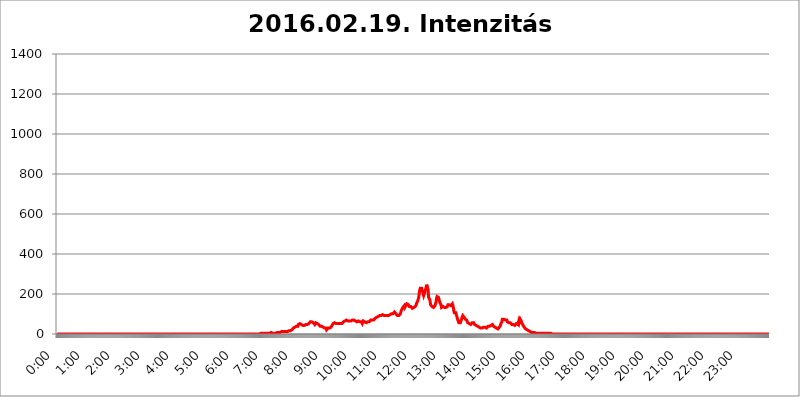
| Category | 2016.02.19. Intenzitás [W/m^2] |
|---|---|
| 0.0 | 0 |
| 0.0006944444444444445 | 0 |
| 0.001388888888888889 | 0 |
| 0.0020833333333333333 | 0 |
| 0.002777777777777778 | 0 |
| 0.003472222222222222 | 0 |
| 0.004166666666666667 | 0 |
| 0.004861111111111111 | 0 |
| 0.005555555555555556 | 0 |
| 0.0062499999999999995 | 0 |
| 0.006944444444444444 | 0 |
| 0.007638888888888889 | 0 |
| 0.008333333333333333 | 0 |
| 0.009027777777777779 | 0 |
| 0.009722222222222222 | 0 |
| 0.010416666666666666 | 0 |
| 0.011111111111111112 | 0 |
| 0.011805555555555555 | 0 |
| 0.012499999999999999 | 0 |
| 0.013194444444444444 | 0 |
| 0.013888888888888888 | 0 |
| 0.014583333333333332 | 0 |
| 0.015277777777777777 | 0 |
| 0.015972222222222224 | 0 |
| 0.016666666666666666 | 0 |
| 0.017361111111111112 | 0 |
| 0.018055555555555557 | 0 |
| 0.01875 | 0 |
| 0.019444444444444445 | 0 |
| 0.02013888888888889 | 0 |
| 0.020833333333333332 | 0 |
| 0.02152777777777778 | 0 |
| 0.022222222222222223 | 0 |
| 0.02291666666666667 | 0 |
| 0.02361111111111111 | 0 |
| 0.024305555555555556 | 0 |
| 0.024999999999999998 | 0 |
| 0.025694444444444447 | 0 |
| 0.02638888888888889 | 0 |
| 0.027083333333333334 | 0 |
| 0.027777777777777776 | 0 |
| 0.02847222222222222 | 0 |
| 0.029166666666666664 | 0 |
| 0.029861111111111113 | 0 |
| 0.030555555555555555 | 0 |
| 0.03125 | 0 |
| 0.03194444444444445 | 0 |
| 0.03263888888888889 | 0 |
| 0.03333333333333333 | 0 |
| 0.034027777777777775 | 0 |
| 0.034722222222222224 | 0 |
| 0.035416666666666666 | 0 |
| 0.036111111111111115 | 0 |
| 0.03680555555555556 | 0 |
| 0.0375 | 0 |
| 0.03819444444444444 | 0 |
| 0.03888888888888889 | 0 |
| 0.03958333333333333 | 0 |
| 0.04027777777777778 | 0 |
| 0.04097222222222222 | 0 |
| 0.041666666666666664 | 0 |
| 0.042361111111111106 | 0 |
| 0.04305555555555556 | 0 |
| 0.043750000000000004 | 0 |
| 0.044444444444444446 | 0 |
| 0.04513888888888889 | 0 |
| 0.04583333333333334 | 0 |
| 0.04652777777777778 | 0 |
| 0.04722222222222222 | 0 |
| 0.04791666666666666 | 0 |
| 0.04861111111111111 | 0 |
| 0.049305555555555554 | 0 |
| 0.049999999999999996 | 0 |
| 0.05069444444444445 | 0 |
| 0.051388888888888894 | 0 |
| 0.052083333333333336 | 0 |
| 0.05277777777777778 | 0 |
| 0.05347222222222222 | 0 |
| 0.05416666666666667 | 0 |
| 0.05486111111111111 | 0 |
| 0.05555555555555555 | 0 |
| 0.05625 | 0 |
| 0.05694444444444444 | 0 |
| 0.057638888888888885 | 0 |
| 0.05833333333333333 | 0 |
| 0.05902777777777778 | 0 |
| 0.059722222222222225 | 0 |
| 0.06041666666666667 | 0 |
| 0.061111111111111116 | 0 |
| 0.06180555555555556 | 0 |
| 0.0625 | 0 |
| 0.06319444444444444 | 0 |
| 0.06388888888888888 | 0 |
| 0.06458333333333334 | 0 |
| 0.06527777777777778 | 0 |
| 0.06597222222222222 | 0 |
| 0.06666666666666667 | 0 |
| 0.06736111111111111 | 0 |
| 0.06805555555555555 | 0 |
| 0.06874999999999999 | 0 |
| 0.06944444444444443 | 0 |
| 0.07013888888888889 | 0 |
| 0.07083333333333333 | 0 |
| 0.07152777777777779 | 0 |
| 0.07222222222222223 | 0 |
| 0.07291666666666667 | 0 |
| 0.07361111111111111 | 0 |
| 0.07430555555555556 | 0 |
| 0.075 | 0 |
| 0.07569444444444444 | 0 |
| 0.0763888888888889 | 0 |
| 0.07708333333333334 | 0 |
| 0.07777777777777778 | 0 |
| 0.07847222222222222 | 0 |
| 0.07916666666666666 | 0 |
| 0.0798611111111111 | 0 |
| 0.08055555555555556 | 0 |
| 0.08125 | 0 |
| 0.08194444444444444 | 0 |
| 0.08263888888888889 | 0 |
| 0.08333333333333333 | 0 |
| 0.08402777777777777 | 0 |
| 0.08472222222222221 | 0 |
| 0.08541666666666665 | 0 |
| 0.08611111111111112 | 0 |
| 0.08680555555555557 | 0 |
| 0.08750000000000001 | 0 |
| 0.08819444444444445 | 0 |
| 0.08888888888888889 | 0 |
| 0.08958333333333333 | 0 |
| 0.09027777777777778 | 0 |
| 0.09097222222222222 | 0 |
| 0.09166666666666667 | 0 |
| 0.09236111111111112 | 0 |
| 0.09305555555555556 | 0 |
| 0.09375 | 0 |
| 0.09444444444444444 | 0 |
| 0.09513888888888888 | 0 |
| 0.09583333333333333 | 0 |
| 0.09652777777777777 | 0 |
| 0.09722222222222222 | 0 |
| 0.09791666666666667 | 0 |
| 0.09861111111111111 | 0 |
| 0.09930555555555555 | 0 |
| 0.09999999999999999 | 0 |
| 0.10069444444444443 | 0 |
| 0.1013888888888889 | 0 |
| 0.10208333333333335 | 0 |
| 0.10277777777777779 | 0 |
| 0.10347222222222223 | 0 |
| 0.10416666666666667 | 0 |
| 0.10486111111111111 | 0 |
| 0.10555555555555556 | 0 |
| 0.10625 | 0 |
| 0.10694444444444444 | 0 |
| 0.1076388888888889 | 0 |
| 0.10833333333333334 | 0 |
| 0.10902777777777778 | 0 |
| 0.10972222222222222 | 0 |
| 0.1111111111111111 | 0 |
| 0.11180555555555556 | 0 |
| 0.11180555555555556 | 0 |
| 0.1125 | 0 |
| 0.11319444444444444 | 0 |
| 0.11388888888888889 | 0 |
| 0.11458333333333333 | 0 |
| 0.11527777777777777 | 0 |
| 0.11597222222222221 | 0 |
| 0.11666666666666665 | 0 |
| 0.1173611111111111 | 0 |
| 0.11805555555555557 | 0 |
| 0.11944444444444445 | 0 |
| 0.12013888888888889 | 0 |
| 0.12083333333333333 | 0 |
| 0.12152777777777778 | 0 |
| 0.12222222222222223 | 0 |
| 0.12291666666666667 | 0 |
| 0.12291666666666667 | 0 |
| 0.12361111111111112 | 0 |
| 0.12430555555555556 | 0 |
| 0.125 | 0 |
| 0.12569444444444444 | 0 |
| 0.12638888888888888 | 0 |
| 0.12708333333333333 | 0 |
| 0.16875 | 0 |
| 0.12847222222222224 | 0 |
| 0.12916666666666668 | 0 |
| 0.12986111111111112 | 0 |
| 0.13055555555555556 | 0 |
| 0.13125 | 0 |
| 0.13194444444444445 | 0 |
| 0.1326388888888889 | 0 |
| 0.13333333333333333 | 0 |
| 0.13402777777777777 | 0 |
| 0.13402777777777777 | 0 |
| 0.13472222222222222 | 0 |
| 0.13541666666666666 | 0 |
| 0.1361111111111111 | 0 |
| 0.13749999999999998 | 0 |
| 0.13819444444444443 | 0 |
| 0.1388888888888889 | 0 |
| 0.13958333333333334 | 0 |
| 0.14027777777777778 | 0 |
| 0.14097222222222222 | 0 |
| 0.14166666666666666 | 0 |
| 0.1423611111111111 | 0 |
| 0.14305555555555557 | 0 |
| 0.14375000000000002 | 0 |
| 0.14444444444444446 | 0 |
| 0.1451388888888889 | 0 |
| 0.1451388888888889 | 0 |
| 0.14652777777777778 | 0 |
| 0.14722222222222223 | 0 |
| 0.14791666666666667 | 0 |
| 0.1486111111111111 | 0 |
| 0.14930555555555555 | 0 |
| 0.15 | 0 |
| 0.15069444444444444 | 0 |
| 0.15138888888888888 | 0 |
| 0.15208333333333332 | 0 |
| 0.15277777777777776 | 0 |
| 0.15347222222222223 | 0 |
| 0.15416666666666667 | 0 |
| 0.15486111111111112 | 0 |
| 0.15555555555555556 | 0 |
| 0.15625 | 0 |
| 0.15694444444444444 | 0 |
| 0.15763888888888888 | 0 |
| 0.15833333333333333 | 0 |
| 0.15902777777777777 | 0 |
| 0.15972222222222224 | 0 |
| 0.16041666666666668 | 0 |
| 0.16111111111111112 | 0 |
| 0.16180555555555556 | 0 |
| 0.1625 | 0 |
| 0.16319444444444445 | 0 |
| 0.1638888888888889 | 0 |
| 0.16458333333333333 | 0 |
| 0.16527777777777777 | 0 |
| 0.16597222222222222 | 0 |
| 0.16666666666666666 | 0 |
| 0.1673611111111111 | 0 |
| 0.16805555555555554 | 0 |
| 0.16874999999999998 | 0 |
| 0.16944444444444443 | 0 |
| 0.17013888888888887 | 0 |
| 0.1708333333333333 | 0 |
| 0.17152777777777775 | 0 |
| 0.17222222222222225 | 0 |
| 0.1729166666666667 | 0 |
| 0.17361111111111113 | 0 |
| 0.17430555555555557 | 0 |
| 0.17500000000000002 | 0 |
| 0.17569444444444446 | 0 |
| 0.1763888888888889 | 0 |
| 0.17708333333333334 | 0 |
| 0.17777777777777778 | 0 |
| 0.17847222222222223 | 0 |
| 0.17916666666666667 | 0 |
| 0.1798611111111111 | 0 |
| 0.18055555555555555 | 0 |
| 0.18125 | 0 |
| 0.18194444444444444 | 0 |
| 0.1826388888888889 | 0 |
| 0.18333333333333335 | 0 |
| 0.1840277777777778 | 0 |
| 0.18472222222222223 | 0 |
| 0.18541666666666667 | 0 |
| 0.18611111111111112 | 0 |
| 0.18680555555555556 | 0 |
| 0.1875 | 0 |
| 0.18819444444444444 | 0 |
| 0.18888888888888888 | 0 |
| 0.18958333333333333 | 0 |
| 0.19027777777777777 | 0 |
| 0.1909722222222222 | 0 |
| 0.19166666666666665 | 0 |
| 0.19236111111111112 | 0 |
| 0.19305555555555554 | 0 |
| 0.19375 | 0 |
| 0.19444444444444445 | 0 |
| 0.1951388888888889 | 0 |
| 0.19583333333333333 | 0 |
| 0.19652777777777777 | 0 |
| 0.19722222222222222 | 0 |
| 0.19791666666666666 | 0 |
| 0.1986111111111111 | 0 |
| 0.19930555555555554 | 0 |
| 0.19999999999999998 | 0 |
| 0.20069444444444443 | 0 |
| 0.20138888888888887 | 0 |
| 0.2020833333333333 | 0 |
| 0.2027777777777778 | 0 |
| 0.2034722222222222 | 0 |
| 0.2041666666666667 | 0 |
| 0.20486111111111113 | 0 |
| 0.20555555555555557 | 0 |
| 0.20625000000000002 | 0 |
| 0.20694444444444446 | 0 |
| 0.2076388888888889 | 0 |
| 0.20833333333333334 | 0 |
| 0.20902777777777778 | 0 |
| 0.20972222222222223 | 0 |
| 0.21041666666666667 | 0 |
| 0.2111111111111111 | 0 |
| 0.21180555555555555 | 0 |
| 0.2125 | 0 |
| 0.21319444444444444 | 0 |
| 0.2138888888888889 | 0 |
| 0.21458333333333335 | 0 |
| 0.2152777777777778 | 0 |
| 0.21597222222222223 | 0 |
| 0.21666666666666667 | 0 |
| 0.21736111111111112 | 0 |
| 0.21805555555555556 | 0 |
| 0.21875 | 0 |
| 0.21944444444444444 | 0 |
| 0.22013888888888888 | 0 |
| 0.22083333333333333 | 0 |
| 0.22152777777777777 | 0 |
| 0.2222222222222222 | 0 |
| 0.22291666666666665 | 0 |
| 0.2236111111111111 | 0 |
| 0.22430555555555556 | 0 |
| 0.225 | 0 |
| 0.22569444444444445 | 0 |
| 0.2263888888888889 | 0 |
| 0.22708333333333333 | 0 |
| 0.22777777777777777 | 0 |
| 0.22847222222222222 | 0 |
| 0.22916666666666666 | 0 |
| 0.2298611111111111 | 0 |
| 0.23055555555555554 | 0 |
| 0.23124999999999998 | 0 |
| 0.23194444444444443 | 0 |
| 0.23263888888888887 | 0 |
| 0.2333333333333333 | 0 |
| 0.2340277777777778 | 0 |
| 0.2347222222222222 | 0 |
| 0.2354166666666667 | 0 |
| 0.23611111111111113 | 0 |
| 0.23680555555555557 | 0 |
| 0.23750000000000002 | 0 |
| 0.23819444444444446 | 0 |
| 0.2388888888888889 | 0 |
| 0.23958333333333334 | 0 |
| 0.24027777777777778 | 0 |
| 0.24097222222222223 | 0 |
| 0.24166666666666667 | 0 |
| 0.2423611111111111 | 0 |
| 0.24305555555555555 | 0 |
| 0.24375 | 0 |
| 0.24444444444444446 | 0 |
| 0.24513888888888888 | 0 |
| 0.24583333333333335 | 0 |
| 0.2465277777777778 | 0 |
| 0.24722222222222223 | 0 |
| 0.24791666666666667 | 0 |
| 0.24861111111111112 | 0 |
| 0.24930555555555556 | 0 |
| 0.25 | 0 |
| 0.25069444444444444 | 0 |
| 0.2513888888888889 | 0 |
| 0.2520833333333333 | 0 |
| 0.25277777777777777 | 0 |
| 0.2534722222222222 | 0 |
| 0.25416666666666665 | 0 |
| 0.2548611111111111 | 0 |
| 0.2555555555555556 | 0 |
| 0.25625000000000003 | 0 |
| 0.2569444444444445 | 0 |
| 0.2576388888888889 | 0 |
| 0.25833333333333336 | 0 |
| 0.2590277777777778 | 0 |
| 0.25972222222222224 | 0 |
| 0.2604166666666667 | 0 |
| 0.2611111111111111 | 0 |
| 0.26180555555555557 | 0 |
| 0.2625 | 0 |
| 0.26319444444444445 | 0 |
| 0.2638888888888889 | 0 |
| 0.26458333333333334 | 0 |
| 0.2652777777777778 | 0 |
| 0.2659722222222222 | 0 |
| 0.26666666666666666 | 0 |
| 0.2673611111111111 | 0 |
| 0.26805555555555555 | 0 |
| 0.26875 | 0 |
| 0.26944444444444443 | 0 |
| 0.2701388888888889 | 0 |
| 0.2708333333333333 | 0 |
| 0.27152777777777776 | 0 |
| 0.2722222222222222 | 0 |
| 0.27291666666666664 | 0 |
| 0.2736111111111111 | 0 |
| 0.2743055555555555 | 0 |
| 0.27499999999999997 | 0 |
| 0.27569444444444446 | 0 |
| 0.27638888888888885 | 0 |
| 0.27708333333333335 | 0 |
| 0.2777777777777778 | 0 |
| 0.27847222222222223 | 0 |
| 0.2791666666666667 | 0 |
| 0.2798611111111111 | 0 |
| 0.28055555555555556 | 0 |
| 0.28125 | 0 |
| 0.28194444444444444 | 0 |
| 0.2826388888888889 | 0 |
| 0.2833333333333333 | 0 |
| 0.28402777777777777 | 0 |
| 0.2847222222222222 | 0 |
| 0.28541666666666665 | 3.525 |
| 0.28611111111111115 | 3.525 |
| 0.28680555555555554 | 3.525 |
| 0.28750000000000003 | 3.525 |
| 0.2881944444444445 | 3.525 |
| 0.2888888888888889 | 3.525 |
| 0.28958333333333336 | 3.525 |
| 0.2902777777777778 | 3.525 |
| 0.29097222222222224 | 3.525 |
| 0.2916666666666667 | 3.525 |
| 0.2923611111111111 | 3.525 |
| 0.29305555555555557 | 3.525 |
| 0.29375 | 3.525 |
| 0.29444444444444445 | 3.525 |
| 0.2951388888888889 | 3.525 |
| 0.29583333333333334 | 3.525 |
| 0.2965277777777778 | 3.525 |
| 0.2972222222222222 | 3.525 |
| 0.29791666666666666 | 3.525 |
| 0.2986111111111111 | 3.525 |
| 0.29930555555555555 | 7.887 |
| 0.3 | 7.887 |
| 0.30069444444444443 | 3.525 |
| 0.3013888888888889 | 3.525 |
| 0.3020833333333333 | 3.525 |
| 0.30277777777777776 | 7.887 |
| 0.3034722222222222 | 7.887 |
| 0.30416666666666664 | 3.525 |
| 0.3048611111111111 | 3.525 |
| 0.3055555555555555 | 3.525 |
| 0.30624999999999997 | 3.525 |
| 0.3069444444444444 | 7.887 |
| 0.3076388888888889 | 7.887 |
| 0.30833333333333335 | 7.887 |
| 0.3090277777777778 | 7.887 |
| 0.30972222222222223 | 7.887 |
| 0.3104166666666667 | 7.887 |
| 0.3111111111111111 | 7.887 |
| 0.31180555555555556 | 7.887 |
| 0.3125 | 7.887 |
| 0.31319444444444444 | 7.887 |
| 0.3138888888888889 | 12.257 |
| 0.3145833333333333 | 12.257 |
| 0.31527777777777777 | 12.257 |
| 0.3159722222222222 | 12.257 |
| 0.31666666666666665 | 12.257 |
| 0.31736111111111115 | 12.257 |
| 0.31805555555555554 | 12.257 |
| 0.31875000000000003 | 12.257 |
| 0.3194444444444445 | 12.257 |
| 0.3201388888888889 | 12.257 |
| 0.32083333333333336 | 12.257 |
| 0.3215277777777778 | 12.257 |
| 0.32222222222222224 | 12.257 |
| 0.3229166666666667 | 12.257 |
| 0.3236111111111111 | 16.636 |
| 0.32430555555555557 | 16.636 |
| 0.325 | 16.636 |
| 0.32569444444444445 | 16.636 |
| 0.3263888888888889 | 16.636 |
| 0.32708333333333334 | 16.636 |
| 0.3277777777777778 | 21.024 |
| 0.3284722222222222 | 21.024 |
| 0.32916666666666666 | 21.024 |
| 0.3298611111111111 | 21.024 |
| 0.33055555555555555 | 25.419 |
| 0.33125 | 29.823 |
| 0.33194444444444443 | 29.823 |
| 0.3326388888888889 | 29.823 |
| 0.3333333333333333 | 34.234 |
| 0.3340277777777778 | 38.653 |
| 0.3347222222222222 | 38.653 |
| 0.3354166666666667 | 38.653 |
| 0.3361111111111111 | 38.653 |
| 0.3368055555555556 | 38.653 |
| 0.33749999999999997 | 38.653 |
| 0.33819444444444446 | 47.511 |
| 0.33888888888888885 | 51.951 |
| 0.33958333333333335 | 47.511 |
| 0.34027777777777773 | 51.951 |
| 0.34097222222222223 | 47.511 |
| 0.3416666666666666 | 47.511 |
| 0.3423611111111111 | 47.511 |
| 0.3430555555555555 | 47.511 |
| 0.34375 | 43.079 |
| 0.3444444444444445 | 43.079 |
| 0.3451388888888889 | 43.079 |
| 0.3458333333333334 | 43.079 |
| 0.34652777777777777 | 43.079 |
| 0.34722222222222227 | 47.511 |
| 0.34791666666666665 | 43.079 |
| 0.34861111111111115 | 47.511 |
| 0.34930555555555554 | 47.511 |
| 0.35000000000000003 | 47.511 |
| 0.3506944444444444 | 47.511 |
| 0.3513888888888889 | 47.511 |
| 0.3520833333333333 | 47.511 |
| 0.3527777777777778 | 51.951 |
| 0.3534722222222222 | 51.951 |
| 0.3541666666666667 | 56.398 |
| 0.3548611111111111 | 60.85 |
| 0.35555555555555557 | 65.31 |
| 0.35625 | 65.31 |
| 0.35694444444444445 | 60.85 |
| 0.3576388888888889 | 60.85 |
| 0.35833333333333334 | 56.398 |
| 0.3590277777777778 | 56.398 |
| 0.3597222222222222 | 56.398 |
| 0.36041666666666666 | 51.951 |
| 0.3611111111111111 | 47.511 |
| 0.36180555555555555 | 51.951 |
| 0.3625 | 56.398 |
| 0.36319444444444443 | 56.398 |
| 0.3638888888888889 | 56.398 |
| 0.3645833333333333 | 51.951 |
| 0.3652777777777778 | 47.511 |
| 0.3659722222222222 | 47.511 |
| 0.3666666666666667 | 47.511 |
| 0.3673611111111111 | 47.511 |
| 0.3680555555555556 | 43.079 |
| 0.36874999999999997 | 38.653 |
| 0.36944444444444446 | 38.653 |
| 0.37013888888888885 | 34.234 |
| 0.37083333333333335 | 38.653 |
| 0.37152777777777773 | 34.234 |
| 0.37222222222222223 | 34.234 |
| 0.3729166666666666 | 34.234 |
| 0.3736111111111111 | 29.823 |
| 0.3743055555555555 | 29.823 |
| 0.375 | 29.823 |
| 0.3756944444444445 | 29.823 |
| 0.3763888888888889 | 34.234 |
| 0.3770833333333334 | 29.823 |
| 0.37777777777777777 | 21.024 |
| 0.37847222222222227 | 21.024 |
| 0.37916666666666665 | 21.024 |
| 0.37986111111111115 | 29.823 |
| 0.38055555555555554 | 29.823 |
| 0.38125000000000003 | 29.823 |
| 0.3819444444444444 | 29.823 |
| 0.3826388888888889 | 29.823 |
| 0.3833333333333333 | 34.234 |
| 0.3840277777777778 | 34.234 |
| 0.3847222222222222 | 38.653 |
| 0.3854166666666667 | 43.079 |
| 0.3861111111111111 | 47.511 |
| 0.38680555555555557 | 51.951 |
| 0.3875 | 56.398 |
| 0.38819444444444445 | 56.398 |
| 0.3888888888888889 | 56.398 |
| 0.38958333333333334 | 56.398 |
| 0.3902777777777778 | 51.951 |
| 0.3909722222222222 | 51.951 |
| 0.39166666666666666 | 51.951 |
| 0.3923611111111111 | 51.951 |
| 0.39305555555555555 | 51.951 |
| 0.39375 | 51.951 |
| 0.39444444444444443 | 51.951 |
| 0.3951388888888889 | 51.951 |
| 0.3958333333333333 | 51.951 |
| 0.3965277777777778 | 51.951 |
| 0.3972222222222222 | 51.951 |
| 0.3979166666666667 | 51.951 |
| 0.3986111111111111 | 51.951 |
| 0.3993055555555556 | 51.951 |
| 0.39999999999999997 | 56.398 |
| 0.40069444444444446 | 56.398 |
| 0.40138888888888885 | 60.85 |
| 0.40208333333333335 | 60.85 |
| 0.40277777777777773 | 65.31 |
| 0.40347222222222223 | 65.31 |
| 0.4041666666666666 | 65.31 |
| 0.4048611111111111 | 69.775 |
| 0.4055555555555555 | 69.775 |
| 0.40625 | 69.775 |
| 0.4069444444444445 | 69.775 |
| 0.4076388888888889 | 65.31 |
| 0.4083333333333334 | 65.31 |
| 0.40902777777777777 | 65.31 |
| 0.40972222222222227 | 65.31 |
| 0.41041666666666665 | 65.31 |
| 0.41111111111111115 | 65.31 |
| 0.41180555555555554 | 65.31 |
| 0.41250000000000003 | 69.775 |
| 0.4131944444444444 | 69.775 |
| 0.4138888888888889 | 69.775 |
| 0.4145833333333333 | 69.775 |
| 0.4152777777777778 | 69.775 |
| 0.4159722222222222 | 69.775 |
| 0.4166666666666667 | 69.775 |
| 0.4173611111111111 | 69.775 |
| 0.41805555555555557 | 65.31 |
| 0.41875 | 65.31 |
| 0.41944444444444445 | 65.31 |
| 0.4201388888888889 | 60.85 |
| 0.42083333333333334 | 60.85 |
| 0.4215277777777778 | 60.85 |
| 0.4222222222222222 | 65.31 |
| 0.42291666666666666 | 65.31 |
| 0.4236111111111111 | 65.31 |
| 0.42430555555555555 | 60.85 |
| 0.425 | 60.85 |
| 0.42569444444444443 | 60.85 |
| 0.4263888888888889 | 60.85 |
| 0.4270833333333333 | 56.398 |
| 0.4277777777777778 | 51.951 |
| 0.4284722222222222 | 56.398 |
| 0.4291666666666667 | 65.31 |
| 0.4298611111111111 | 65.31 |
| 0.4305555555555556 | 65.31 |
| 0.43124999999999997 | 60.85 |
| 0.43194444444444446 | 60.85 |
| 0.43263888888888885 | 60.85 |
| 0.43333333333333335 | 56.398 |
| 0.43402777777777773 | 51.951 |
| 0.43472222222222223 | 56.398 |
| 0.4354166666666666 | 60.85 |
| 0.4361111111111111 | 65.31 |
| 0.4368055555555555 | 60.85 |
| 0.4375 | 60.85 |
| 0.4381944444444445 | 65.31 |
| 0.4388888888888889 | 65.31 |
| 0.4395833333333334 | 69.775 |
| 0.44027777777777777 | 69.775 |
| 0.44097222222222227 | 69.775 |
| 0.44166666666666665 | 69.775 |
| 0.44236111111111115 | 69.775 |
| 0.44305555555555554 | 69.775 |
| 0.44375000000000003 | 69.775 |
| 0.4444444444444444 | 74.246 |
| 0.4451388888888889 | 74.246 |
| 0.4458333333333333 | 78.722 |
| 0.4465277777777778 | 83.205 |
| 0.4472222222222222 | 83.205 |
| 0.4479166666666667 | 83.205 |
| 0.4486111111111111 | 83.205 |
| 0.44930555555555557 | 83.205 |
| 0.45 | 87.692 |
| 0.45069444444444445 | 87.692 |
| 0.4513888888888889 | 92.184 |
| 0.45208333333333334 | 92.184 |
| 0.4527777777777778 | 92.184 |
| 0.4534722222222222 | 92.184 |
| 0.45416666666666666 | 92.184 |
| 0.4548611111111111 | 96.682 |
| 0.45555555555555555 | 96.682 |
| 0.45625 | 96.682 |
| 0.45694444444444443 | 92.184 |
| 0.4576388888888889 | 92.184 |
| 0.4583333333333333 | 92.184 |
| 0.4590277777777778 | 87.692 |
| 0.4597222222222222 | 92.184 |
| 0.4604166666666667 | 92.184 |
| 0.4611111111111111 | 92.184 |
| 0.4618055555555556 | 92.184 |
| 0.46249999999999997 | 92.184 |
| 0.46319444444444446 | 92.184 |
| 0.46388888888888885 | 92.184 |
| 0.46458333333333335 | 92.184 |
| 0.46527777777777773 | 92.184 |
| 0.46597222222222223 | 92.184 |
| 0.4666666666666666 | 96.682 |
| 0.4673611111111111 | 101.184 |
| 0.4680555555555555 | 101.184 |
| 0.46875 | 101.184 |
| 0.4694444444444445 | 101.184 |
| 0.4701388888888889 | 101.184 |
| 0.4708333333333334 | 101.184 |
| 0.47152777777777777 | 105.69 |
| 0.47222222222222227 | 105.69 |
| 0.47291666666666665 | 110.201 |
| 0.47361111111111115 | 110.201 |
| 0.47430555555555554 | 105.69 |
| 0.47500000000000003 | 101.184 |
| 0.4756944444444444 | 101.184 |
| 0.4763888888888889 | 96.682 |
| 0.4770833333333333 | 92.184 |
| 0.4777777777777778 | 92.184 |
| 0.4784722222222222 | 92.184 |
| 0.4791666666666667 | 92.184 |
| 0.4798611111111111 | 96.682 |
| 0.48055555555555557 | 96.682 |
| 0.48125 | 101.184 |
| 0.48194444444444445 | 110.201 |
| 0.4826388888888889 | 114.716 |
| 0.48333333333333334 | 123.758 |
| 0.4840277777777778 | 128.284 |
| 0.4847222222222222 | 132.814 |
| 0.48541666666666666 | 137.347 |
| 0.4861111111111111 | 137.347 |
| 0.48680555555555555 | 141.884 |
| 0.4875 | 132.814 |
| 0.48819444444444443 | 137.347 |
| 0.4888888888888889 | 141.884 |
| 0.4895833333333333 | 141.884 |
| 0.4902777777777778 | 150.964 |
| 0.4909722222222222 | 150.964 |
| 0.4916666666666667 | 150.964 |
| 0.4923611111111111 | 146.423 |
| 0.4930555555555556 | 141.884 |
| 0.49374999999999997 | 137.347 |
| 0.49444444444444446 | 141.884 |
| 0.49513888888888885 | 141.884 |
| 0.49583333333333335 | 137.347 |
| 0.49652777777777773 | 132.814 |
| 0.49722222222222223 | 132.814 |
| 0.4979166666666666 | 128.284 |
| 0.4986111111111111 | 128.284 |
| 0.4993055555555555 | 132.814 |
| 0.5 | 132.814 |
| 0.5006944444444444 | 137.347 |
| 0.5013888888888889 | 137.347 |
| 0.5020833333333333 | 137.347 |
| 0.5027777777777778 | 137.347 |
| 0.5034722222222222 | 146.423 |
| 0.5041666666666667 | 155.509 |
| 0.5048611111111111 | 160.056 |
| 0.5055555555555555 | 164.605 |
| 0.50625 | 169.156 |
| 0.5069444444444444 | 182.82 |
| 0.5076388888888889 | 201.058 |
| 0.5083333333333333 | 219.309 |
| 0.5090277777777777 | 228.436 |
| 0.5097222222222222 | 233 |
| 0.5104166666666666 | 233 |
| 0.5111111111111112 | 228.436 |
| 0.5118055555555555 | 223.873 |
| 0.5125000000000001 | 210.182 |
| 0.5131944444444444 | 201.058 |
| 0.513888888888889 | 191.937 |
| 0.5145833333333333 | 187.378 |
| 0.5152777777777778 | 196.497 |
| 0.5159722222222222 | 214.746 |
| 0.5166666666666667 | 223.873 |
| 0.517361111111111 | 233 |
| 0.5180555555555556 | 246.689 |
| 0.5187499999999999 | 251.251 |
| 0.5194444444444445 | 242.127 |
| 0.5201388888888888 | 219.309 |
| 0.5208333333333334 | 182.82 |
| 0.5215277777777778 | 178.264 |
| 0.5222222222222223 | 173.709 |
| 0.5229166666666667 | 164.605 |
| 0.5236111111111111 | 146.423 |
| 0.5243055555555556 | 141.884 |
| 0.525 | 141.884 |
| 0.5256944444444445 | 137.347 |
| 0.5263888888888889 | 137.347 |
| 0.5270833333333333 | 137.347 |
| 0.5277777777777778 | 132.814 |
| 0.5284722222222222 | 132.814 |
| 0.5291666666666667 | 137.347 |
| 0.5298611111111111 | 141.884 |
| 0.5305555555555556 | 146.423 |
| 0.53125 | 160.056 |
| 0.5319444444444444 | 178.264 |
| 0.5326388888888889 | 187.378 |
| 0.5333333333333333 | 191.937 |
| 0.5340277777777778 | 187.378 |
| 0.5347222222222222 | 182.82 |
| 0.5354166666666667 | 173.709 |
| 0.5361111111111111 | 164.605 |
| 0.5368055555555555 | 155.509 |
| 0.5375 | 155.509 |
| 0.5381944444444444 | 146.423 |
| 0.5388888888888889 | 132.814 |
| 0.5395833333333333 | 132.814 |
| 0.5402777777777777 | 132.814 |
| 0.5409722222222222 | 137.347 |
| 0.5416666666666666 | 141.884 |
| 0.5423611111111112 | 137.347 |
| 0.5430555555555555 | 132.814 |
| 0.5437500000000001 | 132.814 |
| 0.5444444444444444 | 132.814 |
| 0.545138888888889 | 132.814 |
| 0.5458333333333333 | 132.814 |
| 0.5465277777777778 | 137.347 |
| 0.5472222222222222 | 137.347 |
| 0.5479166666666667 | 146.423 |
| 0.548611111111111 | 150.964 |
| 0.5493055555555556 | 146.423 |
| 0.5499999999999999 | 146.423 |
| 0.5506944444444445 | 146.423 |
| 0.5513888888888888 | 146.423 |
| 0.5520833333333334 | 141.884 |
| 0.5527777777777778 | 141.884 |
| 0.5534722222222223 | 146.423 |
| 0.5541666666666667 | 150.964 |
| 0.5548611111111111 | 141.884 |
| 0.5555555555555556 | 132.814 |
| 0.55625 | 114.716 |
| 0.5569444444444445 | 105.69 |
| 0.5576388888888889 | 101.184 |
| 0.5583333333333333 | 101.184 |
| 0.5590277777777778 | 105.69 |
| 0.5597222222222222 | 96.682 |
| 0.5604166666666667 | 87.692 |
| 0.5611111111111111 | 78.722 |
| 0.5618055555555556 | 69.775 |
| 0.5625 | 65.31 |
| 0.5631944444444444 | 56.398 |
| 0.5638888888888889 | 51.951 |
| 0.5645833333333333 | 56.398 |
| 0.5652777777777778 | 56.398 |
| 0.5659722222222222 | 56.398 |
| 0.5666666666666667 | 69.775 |
| 0.5673611111111111 | 78.722 |
| 0.5680555555555555 | 83.205 |
| 0.56875 | 92.184 |
| 0.5694444444444444 | 87.692 |
| 0.5701388888888889 | 92.184 |
| 0.5708333333333333 | 83.205 |
| 0.5715277777777777 | 83.205 |
| 0.5722222222222222 | 74.246 |
| 0.5729166666666666 | 74.246 |
| 0.5736111111111112 | 74.246 |
| 0.5743055555555555 | 69.775 |
| 0.5750000000000001 | 65.31 |
| 0.5756944444444444 | 56.398 |
| 0.576388888888889 | 56.398 |
| 0.5770833333333333 | 56.398 |
| 0.5777777777777778 | 51.951 |
| 0.5784722222222222 | 51.951 |
| 0.5791666666666667 | 47.511 |
| 0.579861111111111 | 47.511 |
| 0.5805555555555556 | 47.511 |
| 0.5812499999999999 | 51.951 |
| 0.5819444444444445 | 56.398 |
| 0.5826388888888888 | 51.951 |
| 0.5833333333333334 | 56.398 |
| 0.5840277777777778 | 56.398 |
| 0.5847222222222223 | 56.398 |
| 0.5854166666666667 | 47.511 |
| 0.5861111111111111 | 47.511 |
| 0.5868055555555556 | 47.511 |
| 0.5875 | 43.079 |
| 0.5881944444444445 | 43.079 |
| 0.5888888888888889 | 38.653 |
| 0.5895833333333333 | 38.653 |
| 0.5902777777777778 | 38.653 |
| 0.5909722222222222 | 34.234 |
| 0.5916666666666667 | 34.234 |
| 0.5923611111111111 | 34.234 |
| 0.5930555555555556 | 29.823 |
| 0.59375 | 29.823 |
| 0.5944444444444444 | 29.823 |
| 0.5951388888888889 | 29.823 |
| 0.5958333333333333 | 29.823 |
| 0.5965277777777778 | 29.823 |
| 0.5972222222222222 | 34.234 |
| 0.5979166666666667 | 34.234 |
| 0.5986111111111111 | 34.234 |
| 0.5993055555555555 | 34.234 |
| 0.6 | 34.234 |
| 0.6006944444444444 | 34.234 |
| 0.6013888888888889 | 34.234 |
| 0.6020833333333333 | 29.823 |
| 0.6027777777777777 | 29.823 |
| 0.6034722222222222 | 34.234 |
| 0.6041666666666666 | 38.653 |
| 0.6048611111111112 | 34.234 |
| 0.6055555555555555 | 34.234 |
| 0.6062500000000001 | 38.653 |
| 0.6069444444444444 | 38.653 |
| 0.607638888888889 | 38.653 |
| 0.6083333333333333 | 43.079 |
| 0.6090277777777778 | 43.079 |
| 0.6097222222222222 | 43.079 |
| 0.6104166666666667 | 47.511 |
| 0.611111111111111 | 43.079 |
| 0.6118055555555556 | 38.653 |
| 0.6124999999999999 | 34.234 |
| 0.6131944444444445 | 34.234 |
| 0.6138888888888888 | 34.234 |
| 0.6145833333333334 | 38.653 |
| 0.6152777777777778 | 34.234 |
| 0.6159722222222223 | 29.823 |
| 0.6166666666666667 | 29.823 |
| 0.6173611111111111 | 29.823 |
| 0.6180555555555556 | 25.419 |
| 0.61875 | 29.823 |
| 0.6194444444444445 | 29.823 |
| 0.6201388888888889 | 34.234 |
| 0.6208333333333333 | 38.653 |
| 0.6215277777777778 | 43.079 |
| 0.6222222222222222 | 51.951 |
| 0.6229166666666667 | 56.398 |
| 0.6236111111111111 | 60.85 |
| 0.6243055555555556 | 74.246 |
| 0.625 | 74.246 |
| 0.6256944444444444 | 69.775 |
| 0.6263888888888889 | 74.246 |
| 0.6270833333333333 | 78.722 |
| 0.6277777777777778 | 69.775 |
| 0.6284722222222222 | 69.775 |
| 0.6291666666666667 | 69.775 |
| 0.6298611111111111 | 65.31 |
| 0.6305555555555555 | 69.775 |
| 0.63125 | 60.85 |
| 0.6319444444444444 | 60.85 |
| 0.6326388888888889 | 65.31 |
| 0.6333333333333333 | 56.398 |
| 0.6340277777777777 | 56.398 |
| 0.6347222222222222 | 56.398 |
| 0.6354166666666666 | 56.398 |
| 0.6361111111111112 | 60.85 |
| 0.6368055555555555 | 56.398 |
| 0.6375000000000001 | 47.511 |
| 0.6381944444444444 | 47.511 |
| 0.638888888888889 | 47.511 |
| 0.6395833333333333 | 47.511 |
| 0.6402777777777778 | 47.511 |
| 0.6409722222222222 | 47.511 |
| 0.6416666666666667 | 43.079 |
| 0.642361111111111 | 43.079 |
| 0.6430555555555556 | 47.511 |
| 0.6437499999999999 | 51.951 |
| 0.6444444444444445 | 47.511 |
| 0.6451388888888888 | 47.511 |
| 0.6458333333333334 | 47.511 |
| 0.6465277777777778 | 51.951 |
| 0.6472222222222223 | 65.31 |
| 0.6479166666666667 | 56.398 |
| 0.6486111111111111 | 60.85 |
| 0.6493055555555556 | 74.246 |
| 0.65 | 78.722 |
| 0.6506944444444445 | 65.31 |
| 0.6513888888888889 | 56.398 |
| 0.6520833333333333 | 51.951 |
| 0.6527777777777778 | 47.511 |
| 0.6534722222222222 | 47.511 |
| 0.6541666666666667 | 43.079 |
| 0.6548611111111111 | 34.234 |
| 0.6555555555555556 | 34.234 |
| 0.65625 | 29.823 |
| 0.6569444444444444 | 25.419 |
| 0.6576388888888889 | 21.024 |
| 0.6583333333333333 | 25.419 |
| 0.6590277777777778 | 21.024 |
| 0.6597222222222222 | 21.024 |
| 0.6604166666666667 | 21.024 |
| 0.6611111111111111 | 16.636 |
| 0.6618055555555555 | 12.257 |
| 0.6625 | 12.257 |
| 0.6631944444444444 | 12.257 |
| 0.6638888888888889 | 12.257 |
| 0.6645833333333333 | 12.257 |
| 0.6652777777777777 | 7.887 |
| 0.6659722222222222 | 7.887 |
| 0.6666666666666666 | 7.887 |
| 0.6673611111111111 | 7.887 |
| 0.6680555555555556 | 7.887 |
| 0.6687500000000001 | 7.887 |
| 0.6694444444444444 | 7.887 |
| 0.6701388888888888 | 3.525 |
| 0.6708333333333334 | 3.525 |
| 0.6715277777777778 | 3.525 |
| 0.6722222222222222 | 3.525 |
| 0.6729166666666666 | 3.525 |
| 0.6736111111111112 | 3.525 |
| 0.6743055555555556 | 3.525 |
| 0.6749999999999999 | 3.525 |
| 0.6756944444444444 | 3.525 |
| 0.6763888888888889 | 3.525 |
| 0.6770833333333334 | 3.525 |
| 0.6777777777777777 | 3.525 |
| 0.6784722222222223 | 3.525 |
| 0.6791666666666667 | 3.525 |
| 0.6798611111111111 | 3.525 |
| 0.6805555555555555 | 3.525 |
| 0.68125 | 3.525 |
| 0.6819444444444445 | 3.525 |
| 0.6826388888888889 | 3.525 |
| 0.6833333333333332 | 3.525 |
| 0.6840277777777778 | 3.525 |
| 0.6847222222222222 | 3.525 |
| 0.6854166666666667 | 3.525 |
| 0.686111111111111 | 3.525 |
| 0.6868055555555556 | 3.525 |
| 0.6875 | 3.525 |
| 0.6881944444444444 | 3.525 |
| 0.688888888888889 | 3.525 |
| 0.6895833333333333 | 3.525 |
| 0.6902777777777778 | 3.525 |
| 0.6909722222222222 | 3.525 |
| 0.6916666666666668 | 3.525 |
| 0.6923611111111111 | 3.525 |
| 0.6930555555555555 | 3.525 |
| 0.69375 | 0 |
| 0.6944444444444445 | 0 |
| 0.6951388888888889 | 0 |
| 0.6958333333333333 | 0 |
| 0.6965277777777777 | 0 |
| 0.6972222222222223 | 0 |
| 0.6979166666666666 | 0 |
| 0.6986111111111111 | 0 |
| 0.6993055555555556 | 0 |
| 0.7000000000000001 | 0 |
| 0.7006944444444444 | 0 |
| 0.7013888888888888 | 0 |
| 0.7020833333333334 | 0 |
| 0.7027777777777778 | 0 |
| 0.7034722222222222 | 0 |
| 0.7041666666666666 | 0 |
| 0.7048611111111112 | 0 |
| 0.7055555555555556 | 0 |
| 0.7062499999999999 | 0 |
| 0.7069444444444444 | 0 |
| 0.7076388888888889 | 0 |
| 0.7083333333333334 | 0 |
| 0.7090277777777777 | 0 |
| 0.7097222222222223 | 0 |
| 0.7104166666666667 | 0 |
| 0.7111111111111111 | 0 |
| 0.7118055555555555 | 0 |
| 0.7125 | 0 |
| 0.7131944444444445 | 0 |
| 0.7138888888888889 | 0 |
| 0.7145833333333332 | 0 |
| 0.7152777777777778 | 0 |
| 0.7159722222222222 | 0 |
| 0.7166666666666667 | 0 |
| 0.717361111111111 | 0 |
| 0.7180555555555556 | 0 |
| 0.71875 | 0 |
| 0.7194444444444444 | 0 |
| 0.720138888888889 | 0 |
| 0.7208333333333333 | 0 |
| 0.7215277777777778 | 0 |
| 0.7222222222222222 | 0 |
| 0.7229166666666668 | 0 |
| 0.7236111111111111 | 0 |
| 0.7243055555555555 | 0 |
| 0.725 | 0 |
| 0.7256944444444445 | 0 |
| 0.7263888888888889 | 0 |
| 0.7270833333333333 | 0 |
| 0.7277777777777777 | 0 |
| 0.7284722222222223 | 0 |
| 0.7291666666666666 | 0 |
| 0.7298611111111111 | 0 |
| 0.7305555555555556 | 0 |
| 0.7312500000000001 | 0 |
| 0.7319444444444444 | 0 |
| 0.7326388888888888 | 0 |
| 0.7333333333333334 | 0 |
| 0.7340277777777778 | 0 |
| 0.7347222222222222 | 0 |
| 0.7354166666666666 | 0 |
| 0.7361111111111112 | 0 |
| 0.7368055555555556 | 0 |
| 0.7374999999999999 | 0 |
| 0.7381944444444444 | 0 |
| 0.7388888888888889 | 0 |
| 0.7395833333333334 | 0 |
| 0.7402777777777777 | 0 |
| 0.7409722222222223 | 0 |
| 0.7416666666666667 | 0 |
| 0.7423611111111111 | 0 |
| 0.7430555555555555 | 0 |
| 0.74375 | 0 |
| 0.7444444444444445 | 0 |
| 0.7451388888888889 | 0 |
| 0.7458333333333332 | 0 |
| 0.7465277777777778 | 0 |
| 0.7472222222222222 | 0 |
| 0.7479166666666667 | 0 |
| 0.748611111111111 | 0 |
| 0.7493055555555556 | 0 |
| 0.75 | 0 |
| 0.7506944444444444 | 0 |
| 0.751388888888889 | 0 |
| 0.7520833333333333 | 0 |
| 0.7527777777777778 | 0 |
| 0.7534722222222222 | 0 |
| 0.7541666666666668 | 0 |
| 0.7548611111111111 | 0 |
| 0.7555555555555555 | 0 |
| 0.75625 | 0 |
| 0.7569444444444445 | 0 |
| 0.7576388888888889 | 0 |
| 0.7583333333333333 | 0 |
| 0.7590277777777777 | 0 |
| 0.7597222222222223 | 0 |
| 0.7604166666666666 | 0 |
| 0.7611111111111111 | 0 |
| 0.7618055555555556 | 0 |
| 0.7625000000000001 | 0 |
| 0.7631944444444444 | 0 |
| 0.7638888888888888 | 0 |
| 0.7645833333333334 | 0 |
| 0.7652777777777778 | 0 |
| 0.7659722222222222 | 0 |
| 0.7666666666666666 | 0 |
| 0.7673611111111112 | 0 |
| 0.7680555555555556 | 0 |
| 0.7687499999999999 | 0 |
| 0.7694444444444444 | 0 |
| 0.7701388888888889 | 0 |
| 0.7708333333333334 | 0 |
| 0.7715277777777777 | 0 |
| 0.7722222222222223 | 0 |
| 0.7729166666666667 | 0 |
| 0.7736111111111111 | 0 |
| 0.7743055555555555 | 0 |
| 0.775 | 0 |
| 0.7756944444444445 | 0 |
| 0.7763888888888889 | 0 |
| 0.7770833333333332 | 0 |
| 0.7777777777777778 | 0 |
| 0.7784722222222222 | 0 |
| 0.7791666666666667 | 0 |
| 0.779861111111111 | 0 |
| 0.7805555555555556 | 0 |
| 0.78125 | 0 |
| 0.7819444444444444 | 0 |
| 0.782638888888889 | 0 |
| 0.7833333333333333 | 0 |
| 0.7840277777777778 | 0 |
| 0.7847222222222222 | 0 |
| 0.7854166666666668 | 0 |
| 0.7861111111111111 | 0 |
| 0.7868055555555555 | 0 |
| 0.7875 | 0 |
| 0.7881944444444445 | 0 |
| 0.7888888888888889 | 0 |
| 0.7895833333333333 | 0 |
| 0.7902777777777777 | 0 |
| 0.7909722222222223 | 0 |
| 0.7916666666666666 | 0 |
| 0.7923611111111111 | 0 |
| 0.7930555555555556 | 0 |
| 0.7937500000000001 | 0 |
| 0.7944444444444444 | 0 |
| 0.7951388888888888 | 0 |
| 0.7958333333333334 | 0 |
| 0.7965277777777778 | 0 |
| 0.7972222222222222 | 0 |
| 0.7979166666666666 | 0 |
| 0.7986111111111112 | 0 |
| 0.7993055555555556 | 0 |
| 0.7999999999999999 | 0 |
| 0.8006944444444444 | 0 |
| 0.8013888888888889 | 0 |
| 0.8020833333333334 | 0 |
| 0.8027777777777777 | 0 |
| 0.8034722222222223 | 0 |
| 0.8041666666666667 | 0 |
| 0.8048611111111111 | 0 |
| 0.8055555555555555 | 0 |
| 0.80625 | 0 |
| 0.8069444444444445 | 0 |
| 0.8076388888888889 | 0 |
| 0.8083333333333332 | 0 |
| 0.8090277777777778 | 0 |
| 0.8097222222222222 | 0 |
| 0.8104166666666667 | 0 |
| 0.811111111111111 | 0 |
| 0.8118055555555556 | 0 |
| 0.8125 | 0 |
| 0.8131944444444444 | 0 |
| 0.813888888888889 | 0 |
| 0.8145833333333333 | 0 |
| 0.8152777777777778 | 0 |
| 0.8159722222222222 | 0 |
| 0.8166666666666668 | 0 |
| 0.8173611111111111 | 0 |
| 0.8180555555555555 | 0 |
| 0.81875 | 0 |
| 0.8194444444444445 | 0 |
| 0.8201388888888889 | 0 |
| 0.8208333333333333 | 0 |
| 0.8215277777777777 | 0 |
| 0.8222222222222223 | 0 |
| 0.8229166666666666 | 0 |
| 0.8236111111111111 | 0 |
| 0.8243055555555556 | 0 |
| 0.8250000000000001 | 0 |
| 0.8256944444444444 | 0 |
| 0.8263888888888888 | 0 |
| 0.8270833333333334 | 0 |
| 0.8277777777777778 | 0 |
| 0.8284722222222222 | 0 |
| 0.8291666666666666 | 0 |
| 0.8298611111111112 | 0 |
| 0.8305555555555556 | 0 |
| 0.8312499999999999 | 0 |
| 0.8319444444444444 | 0 |
| 0.8326388888888889 | 0 |
| 0.8333333333333334 | 0 |
| 0.8340277777777777 | 0 |
| 0.8347222222222223 | 0 |
| 0.8354166666666667 | 0 |
| 0.8361111111111111 | 0 |
| 0.8368055555555555 | 0 |
| 0.8375 | 0 |
| 0.8381944444444445 | 0 |
| 0.8388888888888889 | 0 |
| 0.8395833333333332 | 0 |
| 0.8402777777777778 | 0 |
| 0.8409722222222222 | 0 |
| 0.8416666666666667 | 0 |
| 0.842361111111111 | 0 |
| 0.8430555555555556 | 0 |
| 0.84375 | 0 |
| 0.8444444444444444 | 0 |
| 0.845138888888889 | 0 |
| 0.8458333333333333 | 0 |
| 0.8465277777777778 | 0 |
| 0.8472222222222222 | 0 |
| 0.8479166666666668 | 0 |
| 0.8486111111111111 | 0 |
| 0.8493055555555555 | 0 |
| 0.85 | 0 |
| 0.8506944444444445 | 0 |
| 0.8513888888888889 | 0 |
| 0.8520833333333333 | 0 |
| 0.8527777777777777 | 0 |
| 0.8534722222222223 | 0 |
| 0.8541666666666666 | 0 |
| 0.8548611111111111 | 0 |
| 0.8555555555555556 | 0 |
| 0.8562500000000001 | 0 |
| 0.8569444444444444 | 0 |
| 0.8576388888888888 | 0 |
| 0.8583333333333334 | 0 |
| 0.8590277777777778 | 0 |
| 0.8597222222222222 | 0 |
| 0.8604166666666666 | 0 |
| 0.8611111111111112 | 0 |
| 0.8618055555555556 | 0 |
| 0.8624999999999999 | 0 |
| 0.8631944444444444 | 0 |
| 0.8638888888888889 | 0 |
| 0.8645833333333334 | 0 |
| 0.8652777777777777 | 0 |
| 0.8659722222222223 | 0 |
| 0.8666666666666667 | 0 |
| 0.8673611111111111 | 0 |
| 0.8680555555555555 | 0 |
| 0.86875 | 0 |
| 0.8694444444444445 | 0 |
| 0.8701388888888889 | 0 |
| 0.8708333333333332 | 0 |
| 0.8715277777777778 | 0 |
| 0.8722222222222222 | 0 |
| 0.8729166666666667 | 0 |
| 0.873611111111111 | 0 |
| 0.8743055555555556 | 0 |
| 0.875 | 0 |
| 0.8756944444444444 | 0 |
| 0.876388888888889 | 0 |
| 0.8770833333333333 | 0 |
| 0.8777777777777778 | 0 |
| 0.8784722222222222 | 0 |
| 0.8791666666666668 | 0 |
| 0.8798611111111111 | 0 |
| 0.8805555555555555 | 0 |
| 0.88125 | 0 |
| 0.8819444444444445 | 0 |
| 0.8826388888888889 | 0 |
| 0.8833333333333333 | 0 |
| 0.8840277777777777 | 0 |
| 0.8847222222222223 | 0 |
| 0.8854166666666666 | 0 |
| 0.8861111111111111 | 0 |
| 0.8868055555555556 | 0 |
| 0.8875000000000001 | 0 |
| 0.8881944444444444 | 0 |
| 0.8888888888888888 | 0 |
| 0.8895833333333334 | 0 |
| 0.8902777777777778 | 0 |
| 0.8909722222222222 | 0 |
| 0.8916666666666666 | 0 |
| 0.8923611111111112 | 0 |
| 0.8930555555555556 | 0 |
| 0.8937499999999999 | 0 |
| 0.8944444444444444 | 0 |
| 0.8951388888888889 | 0 |
| 0.8958333333333334 | 0 |
| 0.8965277777777777 | 0 |
| 0.8972222222222223 | 0 |
| 0.8979166666666667 | 0 |
| 0.8986111111111111 | 0 |
| 0.8993055555555555 | 0 |
| 0.9 | 0 |
| 0.9006944444444445 | 0 |
| 0.9013888888888889 | 0 |
| 0.9020833333333332 | 0 |
| 0.9027777777777778 | 0 |
| 0.9034722222222222 | 0 |
| 0.9041666666666667 | 0 |
| 0.904861111111111 | 0 |
| 0.9055555555555556 | 0 |
| 0.90625 | 0 |
| 0.9069444444444444 | 0 |
| 0.907638888888889 | 0 |
| 0.9083333333333333 | 0 |
| 0.9090277777777778 | 0 |
| 0.9097222222222222 | 0 |
| 0.9104166666666668 | 0 |
| 0.9111111111111111 | 0 |
| 0.9118055555555555 | 0 |
| 0.9125 | 0 |
| 0.9131944444444445 | 0 |
| 0.9138888888888889 | 0 |
| 0.9145833333333333 | 0 |
| 0.9152777777777777 | 0 |
| 0.9159722222222223 | 0 |
| 0.9166666666666666 | 0 |
| 0.9173611111111111 | 0 |
| 0.9180555555555556 | 0 |
| 0.9187500000000001 | 0 |
| 0.9194444444444444 | 0 |
| 0.9201388888888888 | 0 |
| 0.9208333333333334 | 0 |
| 0.9215277777777778 | 0 |
| 0.9222222222222222 | 0 |
| 0.9229166666666666 | 0 |
| 0.9236111111111112 | 0 |
| 0.9243055555555556 | 0 |
| 0.9249999999999999 | 0 |
| 0.9256944444444444 | 0 |
| 0.9263888888888889 | 0 |
| 0.9270833333333334 | 0 |
| 0.9277777777777777 | 0 |
| 0.9284722222222223 | 0 |
| 0.9291666666666667 | 0 |
| 0.9298611111111111 | 0 |
| 0.9305555555555555 | 0 |
| 0.93125 | 0 |
| 0.9319444444444445 | 0 |
| 0.9326388888888889 | 0 |
| 0.9333333333333332 | 0 |
| 0.9340277777777778 | 0 |
| 0.9347222222222222 | 0 |
| 0.9354166666666667 | 0 |
| 0.936111111111111 | 0 |
| 0.9368055555555556 | 0 |
| 0.9375 | 0 |
| 0.9381944444444444 | 0 |
| 0.938888888888889 | 0 |
| 0.9395833333333333 | 0 |
| 0.9402777777777778 | 0 |
| 0.9409722222222222 | 0 |
| 0.9416666666666668 | 0 |
| 0.9423611111111111 | 0 |
| 0.9430555555555555 | 0 |
| 0.94375 | 0 |
| 0.9444444444444445 | 0 |
| 0.9451388888888889 | 0 |
| 0.9458333333333333 | 0 |
| 0.9465277777777777 | 0 |
| 0.9472222222222223 | 0 |
| 0.9479166666666666 | 0 |
| 0.9486111111111111 | 0 |
| 0.9493055555555556 | 0 |
| 0.9500000000000001 | 0 |
| 0.9506944444444444 | 0 |
| 0.9513888888888888 | 0 |
| 0.9520833333333334 | 0 |
| 0.9527777777777778 | 0 |
| 0.9534722222222222 | 0 |
| 0.9541666666666666 | 0 |
| 0.9548611111111112 | 0 |
| 0.9555555555555556 | 0 |
| 0.9562499999999999 | 0 |
| 0.9569444444444444 | 0 |
| 0.9576388888888889 | 0 |
| 0.9583333333333334 | 0 |
| 0.9590277777777777 | 0 |
| 0.9597222222222223 | 0 |
| 0.9604166666666667 | 0 |
| 0.9611111111111111 | 0 |
| 0.9618055555555555 | 0 |
| 0.9625 | 0 |
| 0.9631944444444445 | 0 |
| 0.9638888888888889 | 0 |
| 0.9645833333333332 | 0 |
| 0.9652777777777778 | 0 |
| 0.9659722222222222 | 0 |
| 0.9666666666666667 | 0 |
| 0.967361111111111 | 0 |
| 0.9680555555555556 | 0 |
| 0.96875 | 0 |
| 0.9694444444444444 | 0 |
| 0.970138888888889 | 0 |
| 0.9708333333333333 | 0 |
| 0.9715277777777778 | 0 |
| 0.9722222222222222 | 0 |
| 0.9729166666666668 | 0 |
| 0.9736111111111111 | 0 |
| 0.9743055555555555 | 0 |
| 0.975 | 0 |
| 0.9756944444444445 | 0 |
| 0.9763888888888889 | 0 |
| 0.9770833333333333 | 0 |
| 0.9777777777777777 | 0 |
| 0.9784722222222223 | 0 |
| 0.9791666666666666 | 0 |
| 0.9798611111111111 | 0 |
| 0.9805555555555556 | 0 |
| 0.9812500000000001 | 0 |
| 0.9819444444444444 | 0 |
| 0.9826388888888888 | 0 |
| 0.9833333333333334 | 0 |
| 0.9840277777777778 | 0 |
| 0.9847222222222222 | 0 |
| 0.9854166666666666 | 0 |
| 0.9861111111111112 | 0 |
| 0.9868055555555556 | 0 |
| 0.9874999999999999 | 0 |
| 0.9881944444444444 | 0 |
| 0.9888888888888889 | 0 |
| 0.9895833333333334 | 0 |
| 0.9902777777777777 | 0 |
| 0.9909722222222223 | 0 |
| 0.9916666666666667 | 0 |
| 0.9923611111111111 | 0 |
| 0.9930555555555555 | 0 |
| 0.99375 | 0 |
| 0.9944444444444445 | 0 |
| 0.9951388888888889 | 0 |
| 0.9958333333333332 | 0 |
| 0.9965277777777778 | 0 |
| 0.9972222222222222 | 0 |
| 0.9979166666666667 | 0 |
| 0.998611111111111 | 0 |
| 0.9993055555555556 | 0 |